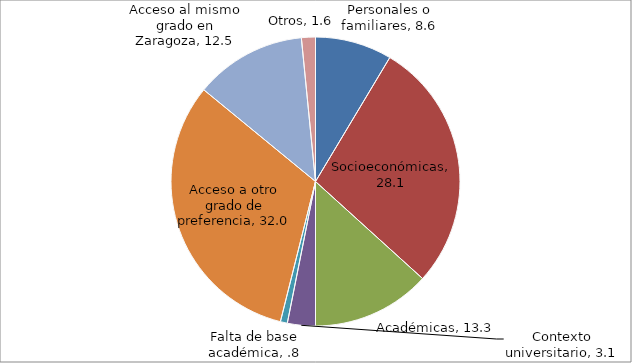
| Category | Series 0 |
|---|---|
| Personales o familiares | 8.594 |
| Socioeconómicas | 28.125 |
| Académicas | 13.281 |
| Contexto universitario | 3.125 |
| Falta de base académica | 0.781 |
| Acceso a otro grado de preferencia | 32.031 |
| Acceso al mismo grado en Zaragoza | 12.5 |
| Otros | 1.562 |